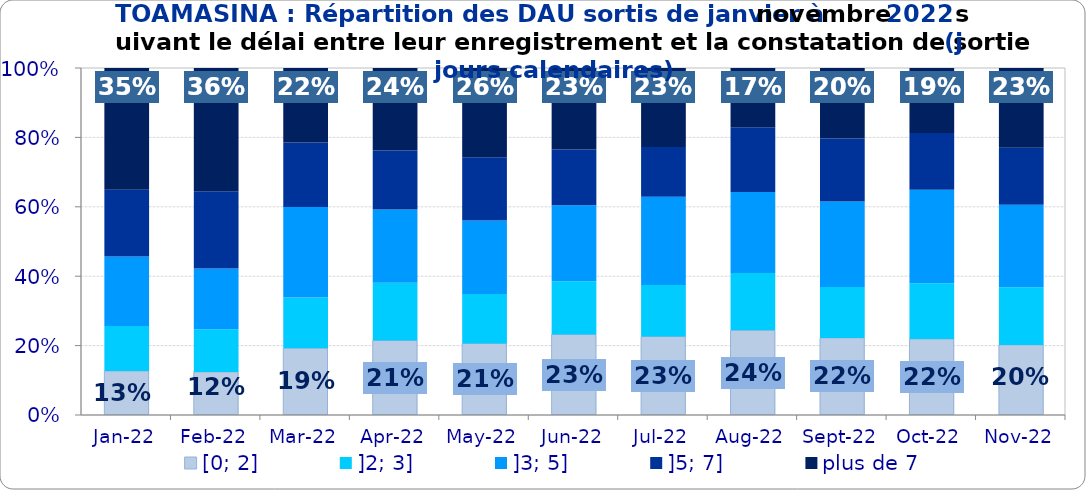
| Category | [0; 2] | ]2; 3] | ]3; 5] | ]5; 7] | plus de 7 |
|---|---|---|---|---|---|
| 2022-01-01 | 0.127 | 0.13 | 0.2 | 0.192 | 0.351 |
| 2022-02-01 | 0.124 | 0.123 | 0.175 | 0.222 | 0.356 |
| 2022-03-01 | 0.192 | 0.146 | 0.261 | 0.186 | 0.215 |
| 2022-04-01 | 0.215 | 0.166 | 0.211 | 0.17 | 0.237 |
| 2022-05-01 | 0.206 | 0.143 | 0.212 | 0.182 | 0.257 |
| 2022-06-01 | 0.232 | 0.153 | 0.219 | 0.16 | 0.235 |
| 2022-07-01 | 0.226 | 0.148 | 0.254 | 0.144 | 0.228 |
| 2022-08-01 | 0.244 | 0.165 | 0.233 | 0.187 | 0.171 |
| 2022-09-01 | 0.222 | 0.146 | 0.247 | 0.181 | 0.203 |
| 2022-10-01 | 0.219 | 0.161 | 0.269 | 0.163 | 0.188 |
| 2022-11-01 | 0.202 | 0.166 | 0.238 | 0.164 | 0.23 |